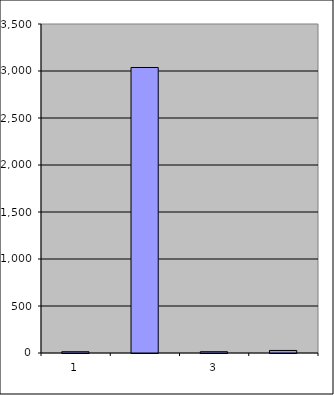
| Category | Series 0 |
|---|---|
| 0 | 13.5 |
| 1 | 3037.163 |
| 2 | 13.649 |
| 3 | 27.195 |